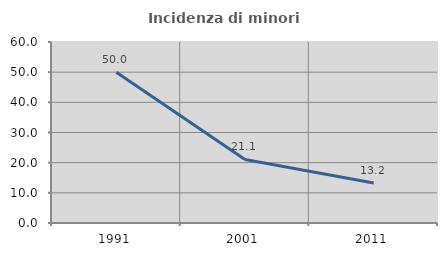
| Category | Incidenza di minori stranieri |
|---|---|
| 1991.0 | 50 |
| 2001.0 | 21.053 |
| 2011.0 | 13.235 |